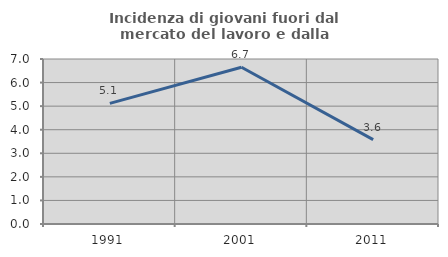
| Category | Incidenza di giovani fuori dal mercato del lavoro e dalla formazione  |
|---|---|
| 1991.0 | 5.117 |
| 2001.0 | 6.652 |
| 2011.0 | 3.579 |